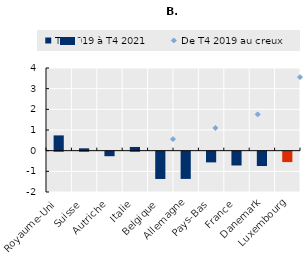
| Category | T4 2019 à T4 2021 |
|---|---|
| Royaume-Uni | 0.739 |
| Suisse | 0.113 |
| Autriche | -0.22 |
| Italie | 0.179 |
| Belgique | -1.321 |
| Allemagne | -1.319 |
| Pays-Bas | -0.518 |
| France | -0.668 |
| Danemark | -0.695 |
| Luxembourg | -0.505 |